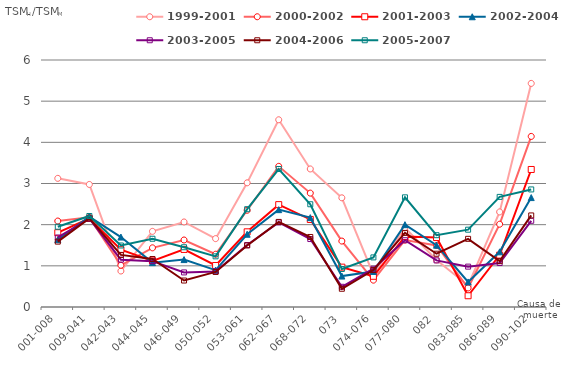
| Category | 1999-2001 | 2000-2002 | 2001-2003 | 2002-2004 | 2003-2005 | 2004-2006 | 2005-2007 |
|---|---|---|---|---|---|---|---|
| 001-008 | 3.125 | 2.088 | 1.805 | 1.636 | 1.689 | 1.588 | 1.95 |
| 009-041 | 2.977 | 2.178 | 2.15 | 2.193 | 2.144 | 2.153 | 2.21 |
| 042-043 | 0.874 | 1.013 | 1.391 | 1.699 | 1.15 | 1.265 | 1.494 |
| 044-045 | 1.837 | 1.437 | 1.121 | 1.078 | 1.114 | 1.166 | 1.658 |
| 046-049 | 2.066 | 1.628 | 1.398 | 1.152 | 0.84 | 0.643 | 1.452 |
| 050-052 | 1.661 | 1.282 | 1.008 | 0.895 | 0.864 | 0.851 | 1.231 |
| 053-061 | 3.016 | 2.35 | 1.826 | 1.767 | 1.505 | 1.495 | 2.376 |
| 062-067 | 4.548 | 3.417 | 2.487 | 2.365 | 2.055 | 2.067 | 3.352 |
| 068-072 | 3.353 | 2.767 | 2.126 | 2.17 | 1.651 | 1.701 | 2.496 |
| 073 | 2.652 | 1.602 | 0.968 | 0.751 | 0.491 | 0.443 | 0.923 |
| 074-076 | 0.786 | 0.653 | 0.746 | 0.863 | 0.929 | 0.897 | 1.205 |
| 077-080 | 1.925 | 1.625 | 1.712 | 2 | 1.622 | 1.799 | 2.664 |
| 082 | 1.143 | 1.496 | 1.687 | 1.502 | 1.132 | 1.294 | 1.745 |
| 083-085 | 0.522 | 0.462 | 0.273 | 0.609 | 0.981 | 1.656 | 1.878 |
| 086-089 | 2.309 | 2.011 | 1.26 | 1.34 | 1.068 | 1.114 | 2.675 |
| 090-102 | 5.431 | 4.144 | 3.34 | 2.658 | 2.094 | 2.224 | 2.856 |